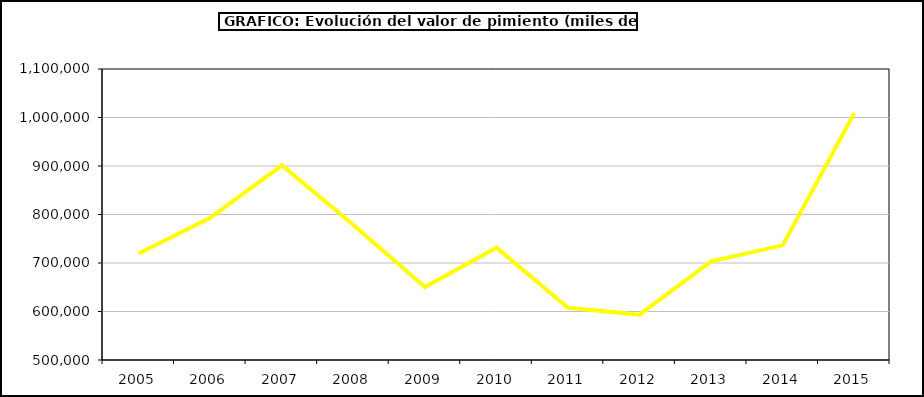
| Category | Valor |
|---|---|
| 2005.0 | 719561.653 |
| 2006.0 | 793226.611 |
| 2007.0 | 901441.129 |
| 2008.0 | 778215.464 |
| 2009.0 | 650428.968 |
| 2010.0 | 731583.218 |
| 2011.0 | 607528.309 |
| 2012.0 | 593530.063 |
| 2013.0 | 703328.169 |
| 2014.0 | 736417.986 |
| 2015.0 | 1008587 |